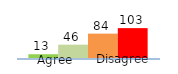
| Category | Series 0 | Series 1 | Series 2 | Series 3 |
|---|---|---|---|---|
| 0 | 13 | 46 | 84 | 103 |